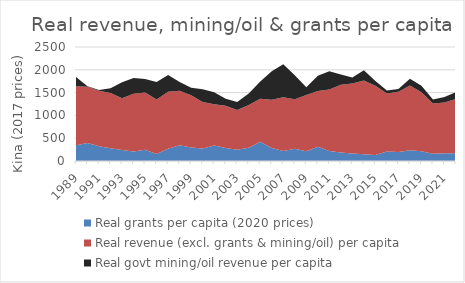
| Category | Real grants per capita (2020 prices) | Real revenue (excl. grants & mining/oil) per capita | Real govt mining/oil revenue per capita |
|---|---|---|---|
| 1989.0 | 344.657 | 1294.509 | 202.943 |
| 1990.0 | 396.757 | 1234.226 | 9.289 |
| 1991.0 | 325.35 | 1217.638 | 11.36 |
| 1992.0 | 278.52 | 1211.13 | 107.265 |
| 1993.0 | 239.858 | 1137.477 | 351.202 |
| 1994.0 | 206.759 | 1266.399 | 348.153 |
| 1995.0 | 247.282 | 1256.887 | 294.399 |
| 1996.0 | 155.378 | 1190.592 | 387.486 |
| 1997.0 | 267.521 | 1248.688 | 371.7 |
| 1998.0 | 346.414 | 1196.06 | 190.627 |
| 1999.0 | 298.577 | 1142.802 | 166.342 |
| 2000.0 | 273.286 | 1018.208 | 283.341 |
| 2001.0 | 340.761 | 905.552 | 263.082 |
| 2002.0 | 287.146 | 926.227 | 151.506 |
| 2003.0 | 245.856 | 872.31 | 176.782 |
| 2004.0 | 289.114 | 940.564 | 250.291 |
| 2005.0 | 419.478 | 946.057 | 375.932 |
| 2006.0 | 285.405 | 1059.236 | 624.919 |
| 2007.0 | 217.667 | 1182.558 | 721.683 |
| 2008.0 | 266.452 | 1089.768 | 524.714 |
| 2009.0 | 213.107 | 1233.885 | 168.324 |
| 2010.0 | 314.152 | 1222.078 | 333.393 |
| 2011.0 | 216.837 | 1348.979 | 402.619 |
| 2012.0 | 184.443 | 1487.574 | 223.539 |
| 2013.0 | 163.283 | 1538.839 | 127.519 |
| 2014.0 | 150.354 | 1612.953 | 229.439 |
| 2015.0 | 131.333 | 1516.285 | 109.394 |
| 2016.0 | 210.538 | 1271.43 | 61.7 |
| 2017.0 | 197.158 | 1323.608 | 57.303 |
| 2018.0 | 235.375 | 1419.16 | 151.467 |
| 2019.0 | 213.854 | 1293.195 | 140.639 |
| 2020.0 | 159.189 | 1104.413 | 87.358 |
| 2021.0 | 168.644 | 1116.068 | 118.892 |
| 2022.0 | 170.28 | 1188.433 | 151.982 |